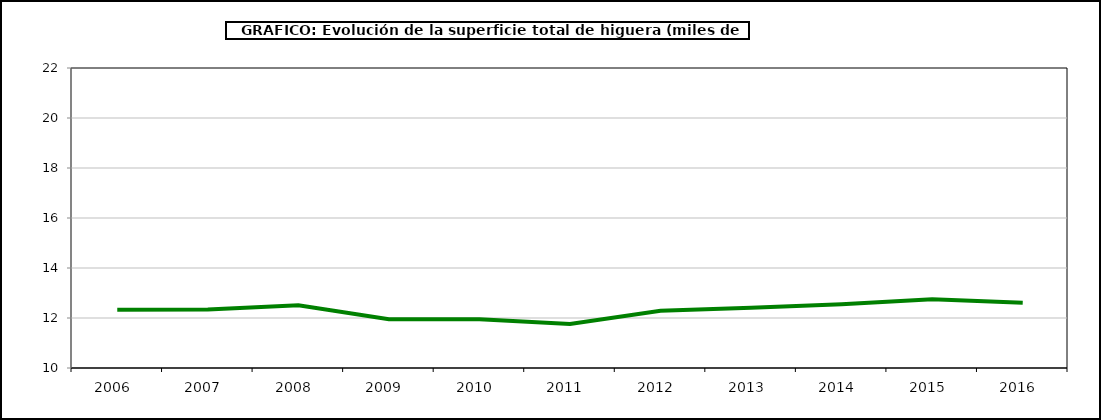
| Category | superficie higuera |
|---|---|
| 2006.0 | 12.332 |
| 2007.0 | 12.344 |
| 2008.0 | 12.509 |
| 2009.0 | 11.953 |
| 2010.0 | 11.953 |
| 2011.0 | 11.761 |
| 2012.0 | 12.294 |
| 2013.0 | 12.411 |
| 2014.0 | 12.549 |
| 2015.0 | 12.751 |
| 2016.0 | 12.613 |